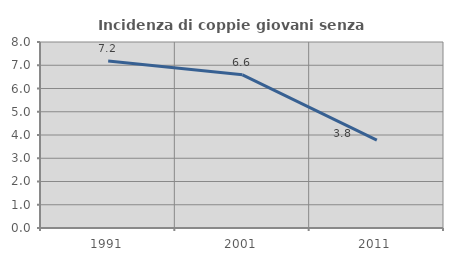
| Category | Incidenza di coppie giovani senza figli |
|---|---|
| 1991.0 | 7.18 |
| 2001.0 | 6.588 |
| 2011.0 | 3.783 |